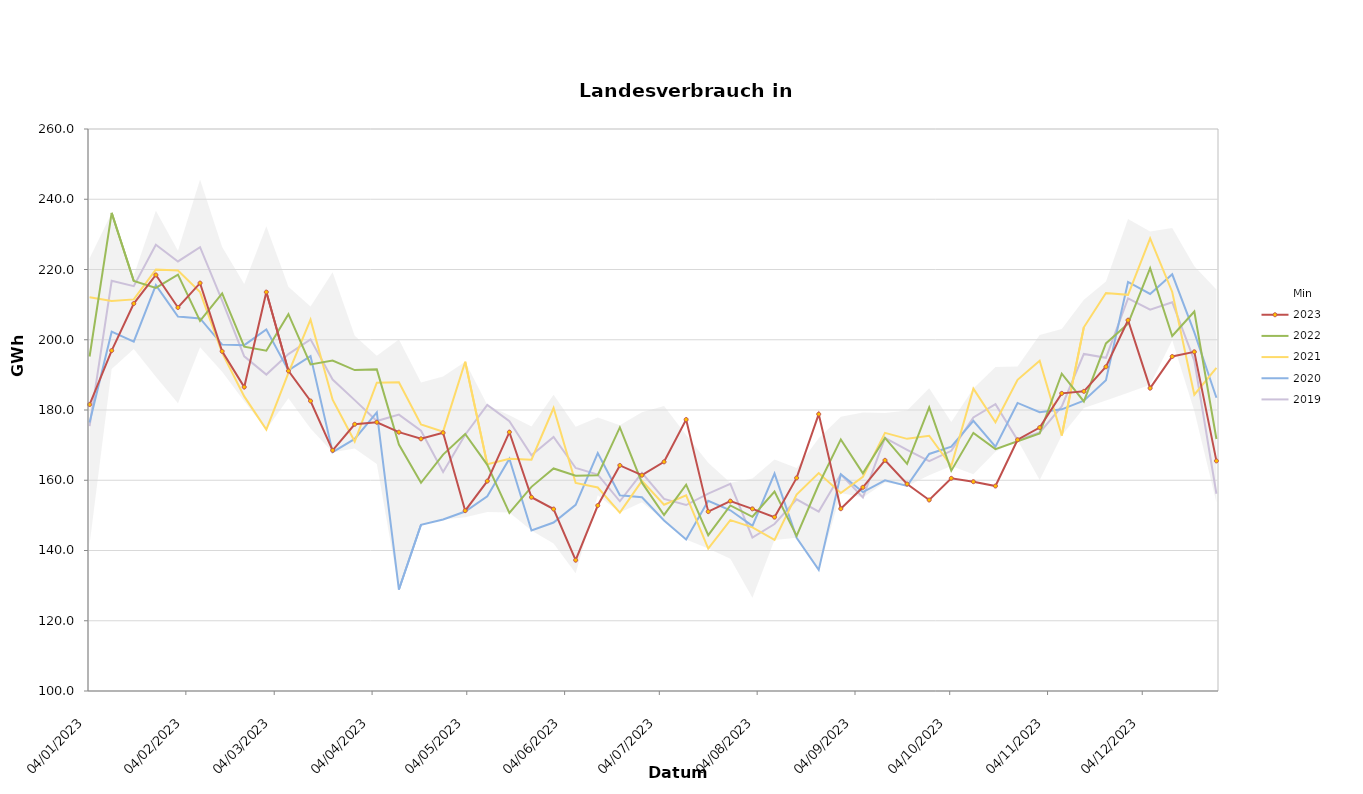
| Category | 2019 | 2020 | 2021 | 2022 | 2023 |
|---|---|---|---|---|---|
| 04/01/2023 | 175.427 | 176.434 | 212.115 | 195.239 | 181.555 |
| 11/01/2023 | 216.769 | 202.298 | 211.044 | 236.116 | 196.922 |
| 18/01/2023 | 215.242 | 199.472 | 211.487 | 216.74 | 210.308 |
| 25/01/2023 | 227.044 | 215.528 | 219.987 | 214.748 | 218.449 |
| 01/02/2023 | 222.292 | 206.627 | 219.737 | 218.553 | 209.184 |
| 08/02/2023 | 226.345 | 206.067 | 213.559 | 205.377 | 216.129 |
| 15/02/2023 | 211.151 | 198.625 | 196.257 | 213.173 | 196.69 |
| 22/02/2023 | 195.293 | 198.461 | 183.868 | 198.033 | 186.533 |
| 01/03/2023 | 190.087 | 202.903 | 174.444 | 196.868 | 213.566 |
| 08/03/2023 | 195.923 | 191.281 | 190.597 | 207.272 | 191.126 |
| 15/03/2023 | 200.114 | 195.338 | 205.721 | 192.973 | 182.562 |
| 22/03/2023 | 188.658 | 167.989 | 182.926 | 194.061 | 168.502 |
| 29/03/2023 | 182.809 | 171.783 | 171.032 | 191.356 | 175.939 |
| 05/04/2023 | 176.858 | 179.333 | 187.766 | 191.565 | 176.513 |
| 12/04/2023 | 178.697 | 128.884 | 187.902 | 170.184 | 173.688 |
| 19/04/2023 | 174.092 | 147.321 | 175.913 | 159.268 | 171.794 |
| 26/04/2023 | 162.352 | 148.827 | 173.832 | 167.309 | 173.522 |
| 03/05/2023 | 172.953 | 151.106 | 193.723 | 173.161 | 151.342 |
| 10/05/2023 | 181.453 | 155.433 | 164.554 | 164.389 | 159.745 |
| 17/05/2023 | 176.814 | 166.147 | 166.118 | 150.733 | 173.696 |
| 24/05/2023 | 167.112 | 145.705 | 165.84 | 158.119 | 155.162 |
| 31/05/2023 | 172.33 | 147.972 | 180.574 | 163.35 | 151.797 |
| 07/06/2023 | 163.5 | 152.992 | 159.225 | 161.279 | 137.249 |
| 14/06/2023 | 161.599 | 167.732 | 157.945 | 161.449 | 152.807 |
| 21/06/2023 | 154.014 | 155.739 | 150.79 | 175.031 | 164.221 |
| 28/06/2023 | 162.117 | 155.156 | 159.81 | 159.306 | 161.437 |
| 05/07/2023 | 154.669 | 148.567 | 153.016 | 150.12 | 165.249 |
| 12/07/2023 | 152.945 | 143.148 | 155.732 | 158.731 | 177.281 |
| 19/07/2023 | 156.199 | 154.156 | 140.565 | 144.356 | 151.069 |
| 26/07/2023 | 158.952 | 151.449 | 148.637 | 152.839 | 154.065 |
| 02/08/2023 | 143.664 | 147.005 | 146.574 | 149.601 | 151.855 |
| 09/08/2023 | 147.536 | 161.882 | 143.011 | 156.768 | 149.495 |
| 16/08/2023 | 154.571 | 143.646 | 155.937 | 144.153 | 160.66 |
| 23/08/2023 | 151.065 | 134.481 | 162.063 | 158.793 | 178.823 |
| 30/08/2023 | 161.679 | 161.727 | 156.356 | 171.621 | 151.891 |
| 06/09/2023 | 155.121 | 156.638 | 160.958 | 161.955 | 157.989 |
| 13/09/2023 | 172.069 | 159.986 | 173.487 | 172.042 | 165.671 |
| 20/09/2023 | 168.658 | 158.38 | 171.785 | 164.648 | 158.926 |
| 27/09/2023 | 165.422 | 167.494 | 172.666 | 180.725 | 154.377 |
| 04/10/2023 | 168.389 | 169.557 | 164.063 | 162.722 | 160.543 |
| 11/10/2023 | 177.883 | 176.896 | 186.089 | 173.49 | 159.586 |
| 18/10/2023 | 181.655 | 169.561 | 176.509 | 168.875 | 158.352 |
| 25/10/2023 | 171.442 | 182.007 | 188.607 | 171.092 | 171.533 |
| 01/11/2023 | 173.575 | 179.396 | 193.997 | 173.346 | 174.998 |
| 08/11/2023 | 181.015 | 180.19 | 172.72 | 190.327 | 184.733 |
| 15/11/2023 | 195.973 | 182.632 | 203.547 | 182.437 | 185.309 |
| 22/11/2023 | 194.86 | 188.447 | 213.29 | 198.958 | 192.303 |
| 29/11/2023 | 211.75 | 216.455 | 212.791 | 204.591 | 205.558 |
| 06/12/2023 | 208.577 | 213.026 | 228.871 | 220.406 | 186.216 |
| 13/12/2023 | 210.685 | 218.633 | 213.615 | 201.067 | 195.226 |
| 20/12/2023 | 194.071 | 202.089 | 184.353 | 208.045 | 196.563 |
| 27/12/2023 | 156.165 | 183.475 | 191.989 | 171.744 | 165.51 |